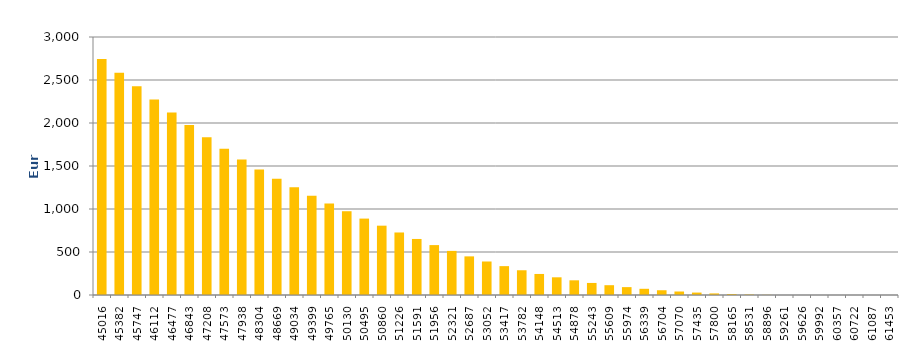
| Category | Series 0 |
|---|---|
| 45016.0 | 2744.034 |
| 45382.0 | 2584.726 |
| 45747.0 | 2428.043 |
| 46112.0 | 2273.841 |
| 46477.0 | 2122.353 |
| 46843.0 | 1975.393 |
| 47208.0 | 1834.638 |
| 47573.0 | 1701.509 |
| 47938.0 | 1576.605 |
| 48304.0 | 1459.989 |
| 48669.0 | 1352.393 |
| 49034.0 | 1251.563 |
| 49399.0 | 1155.388 |
| 49765.0 | 1063.027 |
| 50130.0 | 974.113 |
| 50495.0 | 888.435 |
| 50860.0 | 806.067 |
| 51226.0 | 726.95 |
| 51591.0 | 651.623 |
| 51956.0 | 580.321 |
| 52321.0 | 512.812 |
| 52687.0 | 449.123 |
| 53052.0 | 389.612 |
| 53417.0 | 335.71 |
| 53782.0 | 287.729 |
| 54148.0 | 244.67 |
| 54513.0 | 205.738 |
| 54878.0 | 170.789 |
| 55243.0 | 140.197 |
| 55609.0 | 113.978 |
| 55974.0 | 91.576 |
| 56339.0 | 72.125 |
| 56704.0 | 55.263 |
| 57070.0 | 40.651 |
| 57435.0 | 28.207 |
| 57800.0 | 18.342 |
| 58165.0 | 10.821 |
| 58531.0 | 5.293 |
| 58896.0 | 1.835 |
| 59261.0 | 0.359 |
| 59626.0 | 0.023 |
| 59992.0 | 0.015 |
| 60357.0 | 0.011 |
| 60722.0 | 0.008 |
| 61087.0 | 0.006 |
| 61453.0 | 0.005 |